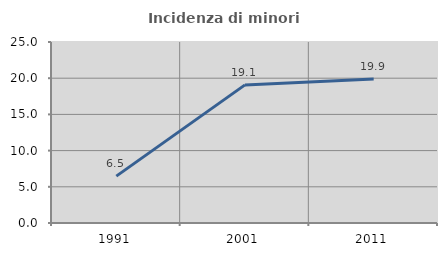
| Category | Incidenza di minori stranieri |
|---|---|
| 1991.0 | 6.475 |
| 2001.0 | 19.076 |
| 2011.0 | 19.883 |